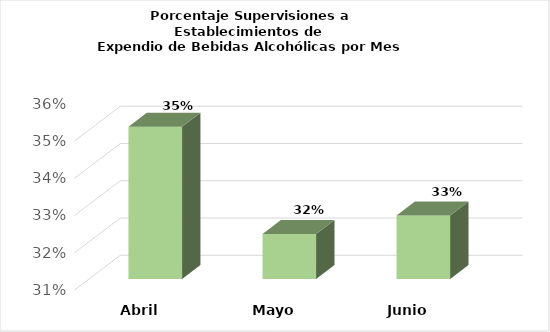
| Category | Series 0 |
|---|---|
| Abril | 0.351 |
| Mayo | 0.322 |
| Junio | 0.327 |